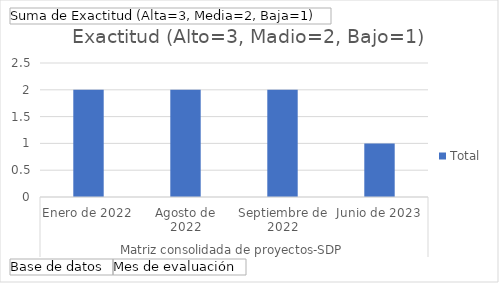
| Category | Total |
|---|---|
| 0 | 2 |
| 1 | 2 |
| 2 | 2 |
| 3 | 1 |